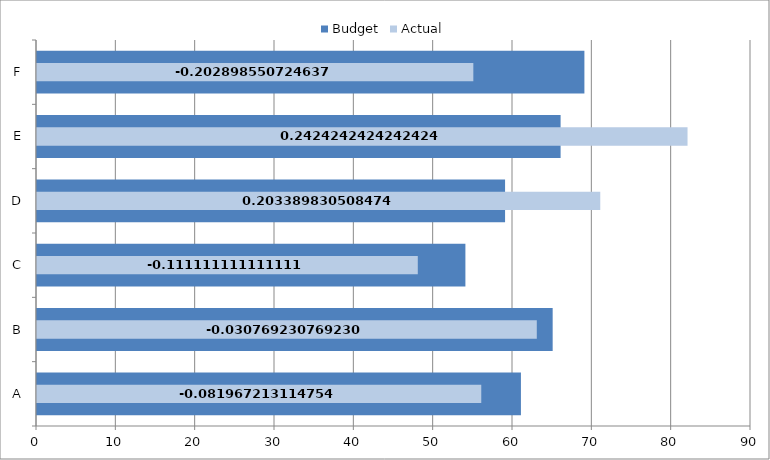
| Category | Budget |
|---|---|
| A | 61 |
| B | 65 |
| C | 54 |
| D | 59 |
| E | 66 |
| F | 69 |